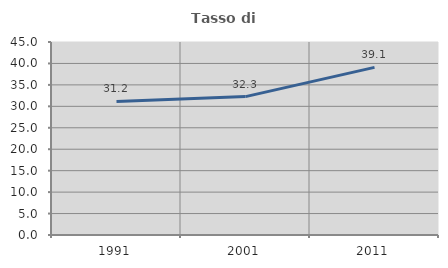
| Category | Tasso di occupazione   |
|---|---|
| 1991.0 | 31.154 |
| 2001.0 | 32.27 |
| 2011.0 | 39.085 |